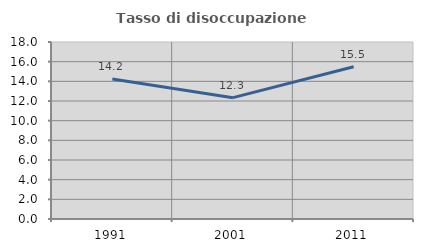
| Category | Tasso di disoccupazione giovanile  |
|---|---|
| 1991.0 | 14.228 |
| 2001.0 | 12.34 |
| 2011.0 | 15.478 |